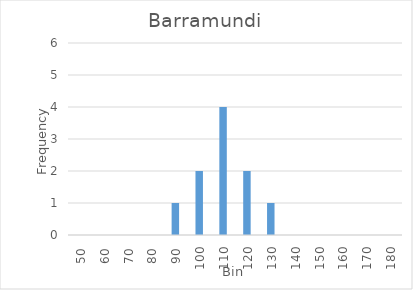
| Category | Frequency |
|---|---|
| 50.0 | 0 |
| 60.0 | 0 |
| 70.0 | 0 |
| 80.0 | 0 |
| 90.0 | 1 |
| 100.0 | 2 |
| 110.0 | 4 |
| 120.0 | 2 |
| 130.0 | 1 |
| 140.0 | 0 |
| 150.0 | 0 |
| 160.0 | 0 |
| 170.0 | 0 |
| 180.0 | 0 |